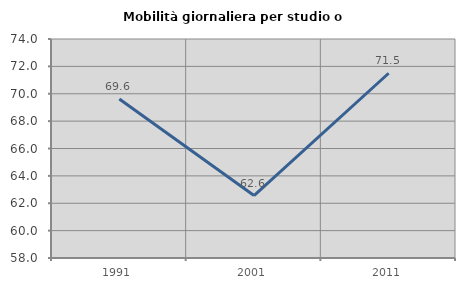
| Category | Mobilità giornaliera per studio o lavoro |
|---|---|
| 1991.0 | 69.62 |
| 2001.0 | 62.562 |
| 2011.0 | 71.497 |